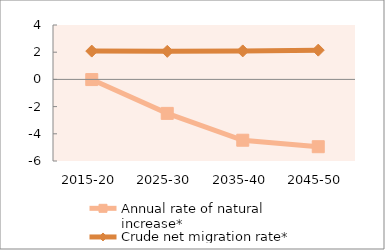
| Category | Annual rate of natural increase* | Crude net migration rate* |
|---|---|---|
| 2015-20 | -0.013 | 2.082 |
| 2025-30 | -2.499 | 2.064 |
| 2035-40 | -4.473 | 2.095 |
| 2045-50 | -4.949 | 2.151 |